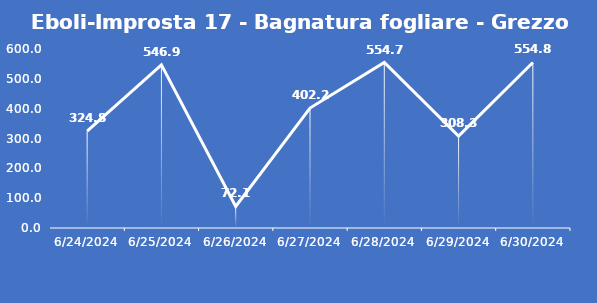
| Category | Eboli-Improsta 17 - Bagnatura fogliare - Grezzo (min) |
|---|---|
| 6/24/24 | 324.8 |
| 6/25/24 | 546.9 |
| 6/26/24 | 72.1 |
| 6/27/24 | 402.2 |
| 6/28/24 | 554.7 |
| 6/29/24 | 308.3 |
| 6/30/24 | 554.8 |